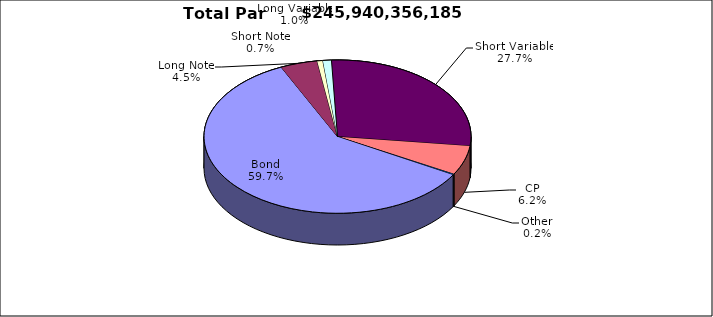
| Category | Par Value |
|---|---|
| Bond | 146898756470 |
| Long Note | 11060288392 |
| Short Note | 1685370322 |
| Long Variable | 2546025916 |
| Short Variable | 68108601405 |
| CP | 15200005000 |
| Other | 441308680 |